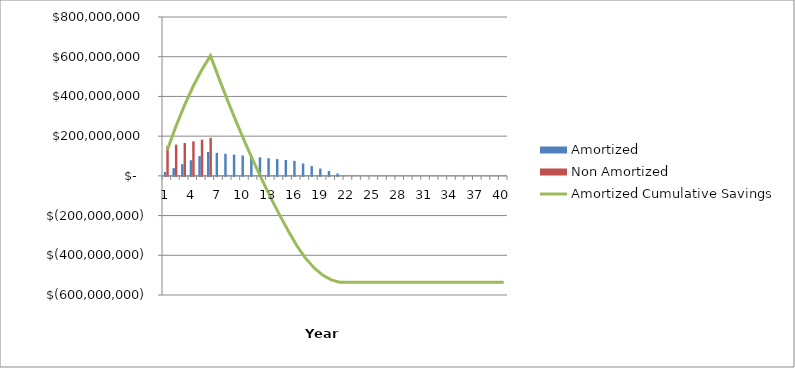
| Category | Amortized | Non Amortized |
|---|---|---|
| 0 | 19218750 | 150000000 |
| 1 | 38742187.5 | 157500000 |
| 2 | 58585546.875 | 165375000 |
| 3 | 78764824.219 | 173643750 |
| 4 | 99296815.43 | 182325937.5 |
| 5 | 120199156.201 | 191442234.375 |
| 6 | 115735400.918 | 0 |
| 7 | 111271645.635 | 0 |
| 8 | 106807890.352 | 0 |
| 9 | 102344135.068 | 0 |
| 10 | 97880379.785 | 0 |
| 11 | 93416624.502 | 0 |
| 12 | 88952869.219 | 0 |
| 13 | 84489113.936 | 0 |
| 14 | 80025358.652 | 0 |
| 15 | 75561603.369 | 0 |
| 16 | 62379098.086 | 0 |
| 17 | 49416905.303 | 0 |
| 18 | 36686040.645 | 0 |
| 19 | 24198070.518 | 0 |
| 20 | 11965139.648 | 0 |
| 21 | 0 | 0 |
| 22 | 0 | 0 |
| 23 | 0 | 0 |
| 24 | 0 | 0 |
| 25 | 0 | 0 |
| 26 | 0 | 0 |
| 27 | 0 | 0 |
| 28 | 0 | 0 |
| 29 | 0 | 0 |
| 30 | 0 | 0 |
| 31 | 0 | 0 |
| 32 | 0 | 0 |
| 33 | 0 | 0 |
| 34 | 0 | 0 |
| 35 | 0 | 0 |
| 36 | 0 | 0 |
| 37 | 0 | 0 |
| 38 | 0 | 0 |
| 39 | 0 | 0 |